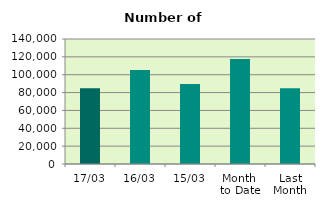
| Category | Series 0 |
|---|---|
| 17/03 | 84956 |
| 16/03 | 105338 |
| 15/03 | 89590 |
| Month 
to Date | 117624.308 |
| Last
Month | 84726.4 |